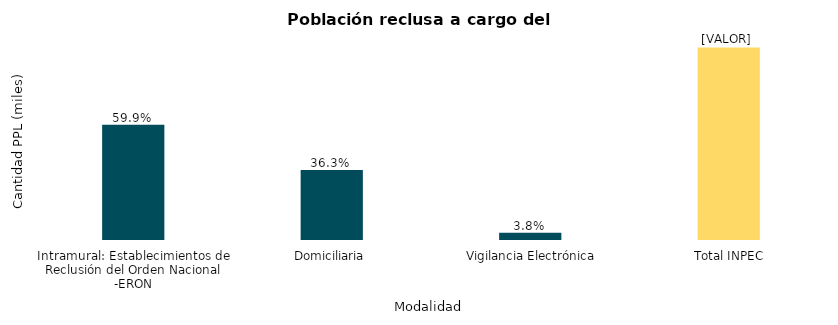
| Category | Total PPL |
|---|---|
| Intramural: Establecimientos de Reclusión del Orden Nacional -ERON | 102191 |
| Domiciliaria | 62025 |
|  Vigilancia Electrónica | 6475 |
|  Total INPEC | 170691 |